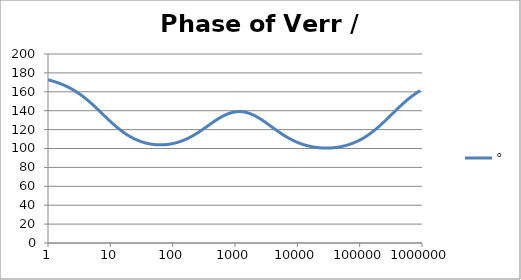
| Category | ° |
|---|---|
| 1.0 | 172.698 |
| 1.0715193052376064 | 172.182 |
| 1.1481536214968828 | 171.631 |
| 1.2302687708123814 | 171.042 |
| 1.318256738556407 | 170.413 |
| 1.4125375446227544 | 169.743 |
| 1.513561248436208 | 169.027 |
| 1.6218100973589298 | 168.264 |
| 1.7378008287493754 | 167.452 |
| 1.8620871366628673 | 166.587 |
| 1.9952623149688797 | 165.668 |
| 2.1379620895022318 | 164.692 |
| 2.2908676527677727 | 163.656 |
| 2.45470891568503 | 162.559 |
| 2.6302679918953817 | 161.399 |
| 2.8183829312644537 | 160.174 |
| 3.0199517204020156 | 158.883 |
| 3.235936569296282 | 157.526 |
| 3.467368504525316 | 156.102 |
| 3.7153522909717256 | 154.612 |
| 3.9810717055349727 | 153.057 |
| 4.265795188015926 | 151.44 |
| 4.570881896148749 | 149.765 |
| 4.897788193684462 | 148.034 |
| 5.2480746024977245 | 146.254 |
| 5.62341325190349 | 144.43 |
| 6.025595860743575 | 142.57 |
| 6.456542290346554 | 140.681 |
| 6.918309709189363 | 138.772 |
| 7.4131024130091765 | 136.853 |
| 7.943282347242814 | 134.933 |
| 8.511380382023765 | 133.022 |
| 9.120108393559095 | 131.128 |
| 9.772372209558105 | 129.262 |
| 10.47128548050899 | 127.433 |
| 11.22018454301963 | 125.648 |
| 12.022644346174127 | 123.915 |
| 12.88249551693134 | 122.241 |
| 13.803842646028851 | 120.63 |
| 14.791083881682074 | 119.087 |
| 15.848931924611136 | 117.616 |
| 16.98243652461744 | 116.221 |
| 18.197008586099834 | 114.901 |
| 19.498445997580447 | 113.66 |
| 20.892961308540382 | 112.496 |
| 22.387211385683386 | 111.412 |
| 23.988329190194897 | 110.404 |
| 25.703957827688622 | 109.475 |
| 27.54228703338165 | 108.621 |
| 29.51209226666385 | 107.842 |
| 31.62277660168379 | 107.136 |
| 33.884415613920254 | 106.503 |
| 36.307805477010106 | 105.94 |
| 38.90451449942804 | 105.446 |
| 41.686938347033525 | 105.021 |
| 44.6683592150963 | 104.662 |
| 47.86300923226381 | 104.369 |
| 51.28613839913647 | 104.141 |
| 54.95408738576247 | 103.976 |
| 58.88436553555889 | 103.876 |
| 63.09573444801931 | 103.838 |
| 67.60829753919813 | 103.863 |
| 72.44359600749901 | 103.951 |
| 77.62471166286915 | 104.102 |
| 83.17637711026705 | 104.315 |
| 89.12509381337456 | 104.592 |
| 95.49925860214357 | 104.933 |
| 102.32929922807544 | 105.338 |
| 109.64781961431841 | 105.807 |
| 117.48975549395293 | 106.343 |
| 125.89254117941665 | 106.944 |
| 134.89628825916537 | 107.612 |
| 144.54397707459273 | 108.347 |
| 154.88166189124806 | 109.148 |
| 165.95869074375608 | 110.016 |
| 177.82794100389225 | 110.95 |
| 190.5460717963248 | 111.948 |
| 204.17379446695278 | 113.009 |
| 218.77616239495524 | 114.131 |
| 234.42288153199212 | 115.309 |
| 251.18864315095806 | 116.54 |
| 269.15348039269156 | 117.818 |
| 288.4031503126605 | 119.138 |
| 309.0295432513591 | 120.491 |
| 331.1311214825911 | 121.87 |
| 354.81338923357566 | 123.265 |
| 380.18939632056095 | 124.667 |
| 407.3802778041123 | 126.064 |
| 436.5158322401654 | 127.445 |
| 467.7351412871979 | 128.797 |
| 501.18723362727184 | 130.11 |
| 537.0317963702526 | 131.371 |
| 575.4399373371566 | 132.569 |
| 616.5950018614822 | 133.692 |
| 660.6934480075952 | 134.73 |
| 707.9457843841375 | 135.674 |
| 758.5775750291831 | 136.515 |
| 812.8305161640983 | 137.246 |
| 870.9635899560801 | 137.86 |
| 933.2543007969903 | 138.352 |
| 999.9999999999998 | 138.717 |
| 1071.5193052376057 | 138.952 |
| 1148.1536214968828 | 139.056 |
| 1230.2687708123801 | 139.027 |
| 1318.2567385564053 | 138.865 |
| 1412.537544622753 | 138.572 |
| 1513.5612484362066 | 138.149 |
| 1621.8100973589292 | 137.601 |
| 1737.8008287493742 | 136.931 |
| 1862.0871366628671 | 136.146 |
| 1995.2623149688786 | 135.251 |
| 2137.9620895022326 | 134.254 |
| 2290.867652767771 | 133.165 |
| 2454.708915685027 | 131.993 |
| 2630.26799189538 | 130.747 |
| 2818.382931264451 | 129.441 |
| 3019.9517204020176 | 128.083 |
| 3235.9365692962774 | 126.688 |
| 3467.368504525316 | 125.266 |
| 3715.352290971724 | 123.828 |
| 3981.07170553497 | 122.387 |
| 4265.795188015923 | 120.953 |
| 4570.881896148745 | 119.535 |
| 4897.788193684463 | 118.141 |
| 5248.074602497726 | 116.781 |
| 5623.413251903489 | 115.461 |
| 6025.595860743574 | 114.186 |
| 6456.54229034655 | 112.961 |
| 6918.309709189357 | 111.79 |
| 7413.102413009165 | 110.675 |
| 7943.282347242815 | 109.619 |
| 8511.380382023763 | 108.623 |
| 9120.108393559092 | 107.687 |
| 9772.3722095581 | 106.813 |
| 10471.285480509003 | 105.999 |
| 11220.184543019639 | 105.245 |
| 12022.64434617411 | 104.55 |
| 12882.495516931338 | 103.913 |
| 13803.842646028841 | 103.333 |
| 14791.083881682063 | 102.81 |
| 15848.931924611119 | 102.341 |
| 16982.436524617453 | 101.926 |
| 18197.008586099837 | 101.563 |
| 19498.445997580417 | 101.253 |
| 20892.961308540387 | 100.992 |
| 22387.211385683382 | 100.782 |
| 23988.32919019488 | 100.622 |
| 25703.957827688606 | 100.51 |
| 27542.28703338167 | 100.446 |
| 29512.092266663854 | 100.431 |
| 31622.77660168378 | 100.465 |
| 33884.41561392023 | 100.547 |
| 36307.805477010166 | 100.677 |
| 38904.514499428085 | 100.858 |
| 41686.93834703348 | 101.088 |
| 44668.35921509631 | 101.37 |
| 47863.00923226382 | 101.704 |
| 51286.13839913646 | 102.091 |
| 54954.08738576241 | 102.532 |
| 58884.365535558936 | 103.03 |
| 63095.73444801934 | 103.586 |
| 67608.29753919817 | 104.201 |
| 72443.59600749899 | 104.877 |
| 77624.71166286913 | 105.617 |
| 83176.37711026703 | 106.422 |
| 89125.09381337445 | 107.293 |
| 95499.25860214363 | 108.233 |
| 102329.29922807543 | 109.244 |
| 109647.81961431848 | 110.326 |
| 117489.75549395289 | 111.481 |
| 125892.54117941685 | 112.71 |
| 134896.28825916522 | 114.013 |
| 144543.97707459255 | 115.389 |
| 154881.66189124787 | 116.838 |
| 165958.69074375575 | 118.358 |
| 177827.9410038922 | 119.947 |
| 190546.07179632425 | 121.601 |
| 204173.79446695274 | 123.316 |
| 218776.16239495497 | 125.087 |
| 234422.88153199226 | 126.907 |
| 251188.64315095753 | 128.769 |
| 269153.480392691 | 130.665 |
| 288403.15031266044 | 132.588 |
| 309029.5432513582 | 134.526 |
| 331131.1214825907 | 136.472 |
| 354813.3892335749 | 138.415 |
| 380189.3963205612 | 140.345 |
| 407380.2778041119 | 142.255 |
| 436515.8322401649 | 144.135 |
| 467735.14128719777 | 145.978 |
| 501187.2336272717 | 147.775 |
| 537031.7963702519 | 149.522 |
| 575439.9373371559 | 151.213 |
| 616595.001861482 | 152.845 |
| 660693.4480075944 | 154.413 |
| 707945.7843841374 | 155.915 |
| 758577.575029183 | 157.351 |
| 812830.5161640996 | 158.72 |
| 870963.5899560791 | 160.022 |
| 933254.3007969892 | 161.257 |